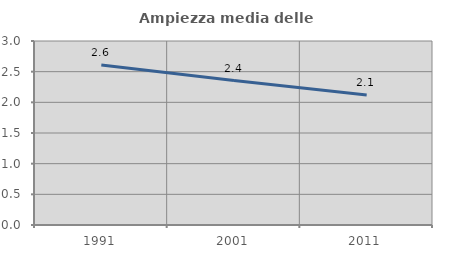
| Category | Ampiezza media delle famiglie |
|---|---|
| 1991.0 | 2.607 |
| 2001.0 | 2.354 |
| 2011.0 | 2.118 |